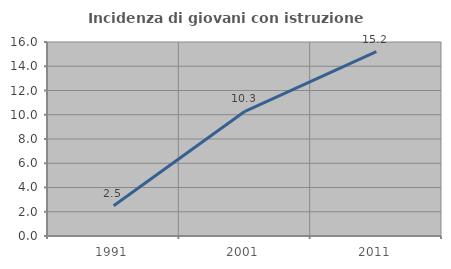
| Category | Incidenza di giovani con istruzione universitaria |
|---|---|
| 1991.0 | 2.5 |
| 2001.0 | 10.284 |
| 2011.0 | 15.207 |